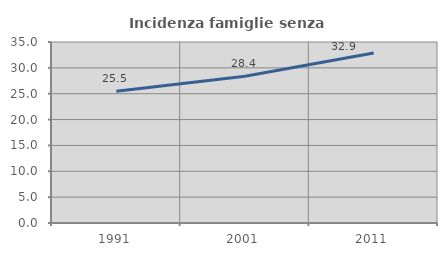
| Category | Incidenza famiglie senza nuclei |
|---|---|
| 1991.0 | 25.462 |
| 2001.0 | 28.381 |
| 2011.0 | 32.854 |